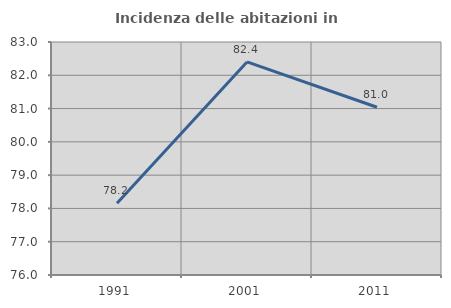
| Category | Incidenza delle abitazioni in proprietà  |
|---|---|
| 1991.0 | 78.157 |
| 2001.0 | 82.402 |
| 2011.0 | 81.041 |